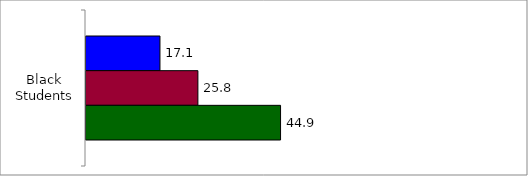
| Category | 50 States and D.C. | SREB States | State |
|---|---|---|---|
| 0 | 17.079 | 25.844 | 44.931 |